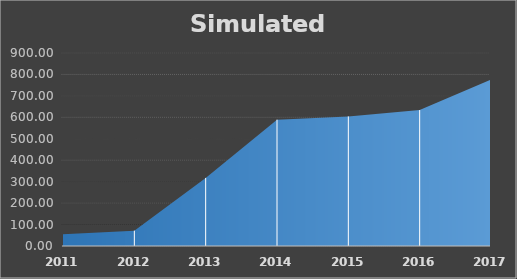
| Category | Simulated Growth |
|---|---|
| 2011.0 | 54.81 |
| 2012.0 | 71.69 |
| 2013.0 | 317.42 |
| 2014.0 | 589.18 |
| 2015.0 | 604.35 |
| 2016.0 | 633.86 |
| 2017.0 | 776.54 |